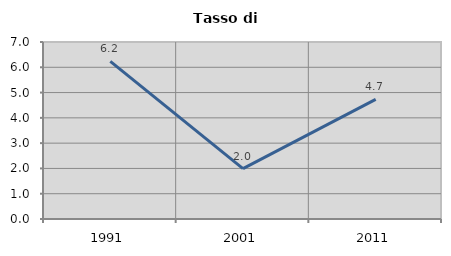
| Category | Tasso di disoccupazione   |
|---|---|
| 1991.0 | 6.232 |
| 2001.0 | 1.994 |
| 2011.0 | 4.73 |